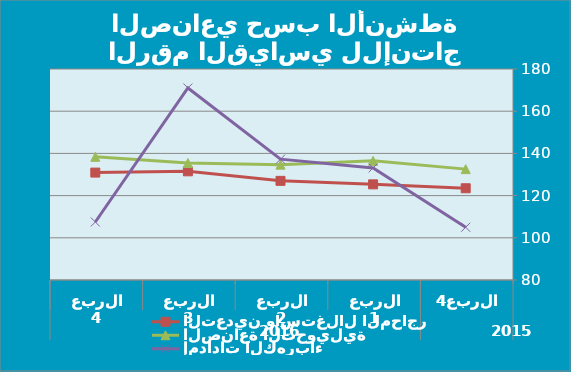
| Category | IIPالرقم القياسي العام  | التعدين واستغلال المحاجر | الصناعة التحويلية | إمدادات الكهرباء |
|---|---|---|---|---|
| 0 |  | 123.48 | 132.55 | 105 |
| 1 |  | 125.33 | 136.47 | 133.12 |
| 2 |  | 126.99 | 134.67 | 137.27 |
| 3 |  | 131.51 | 135.43 | 171 |
| 4 |  | 130.91 | 138.37 | 107.49 |